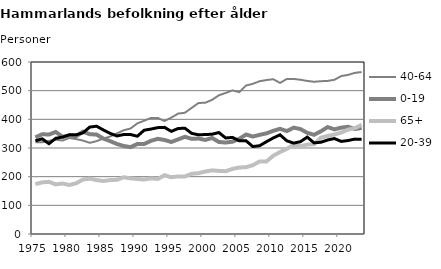
| Category | 40-64 | 0-19 | 65+ | 20-39 |
|---|---|---|---|---|
| 1975.0 | 320 | 337 | 174 | 325 |
| 1976.0 | 320 | 348 | 180 | 332 |
| 1977.0 | 325 | 347 | 182 | 315 |
| 1978.0 | 329 | 356 | 173 | 334 |
| 1979.0 | 326 | 339 | 176 | 338 |
| 1980.0 | 335 | 344 | 171 | 346 |
| 1981.0 | 331 | 341 | 177 | 346 |
| 1982.0 | 326 | 357 | 190 | 353 |
| 1983.0 | 318 | 348 | 193 | 373 |
| 1984.0 | 324 | 347 | 188 | 376 |
| 1985.0 | 333 | 333 | 185 | 363 |
| 1986.0 | 340 | 324 | 188 | 351 |
| 1987.0 | 351 | 314 | 189 | 342 |
| 1988.0 | 362 | 307 | 198 | 347 |
| 1989.0 | 368 | 303 | 194 | 347 |
| 1990.0 | 386 | 314 | 192 | 341 |
| 1991.0 | 395 | 314 | 190 | 362 |
| 1992.0 | 405 | 325 | 194 | 366 |
| 1993.0 | 405 | 332 | 192 | 371 |
| 1994.0 | 394 | 328 | 205 | 372 |
| 1995.0 | 406 | 321 | 198 | 358 |
| 1996.0 | 420 | 330 | 201 | 368 |
| 1997.0 | 423 | 339 | 201 | 369 |
| 1998.0 | 440 | 332 | 210 | 351 |
| 1999.0 | 457 | 333 | 212 | 346 |
| 2000.0 | 458 | 328 | 218 | 347 |
| 2001.0 | 468 | 335 | 222 | 348 |
| 2002.0 | 484 | 321 | 220 | 354 |
| 2003.0 | 492 | 319 | 219 | 335 |
| 2004.0 | 501 | 322 | 227 | 337 |
| 2005.0 | 495 | 332 | 232 | 325 |
| 2006.0 | 518 | 347 | 233 | 325 |
| 2007.0 | 524 | 340 | 240 | 305 |
| 2008.0 | 533 | 346 | 253 | 308 |
| 2009.0 | 537 | 351 | 253 | 322 |
| 2010.0 | 540 | 360 | 273 | 335 |
| 2011.0 | 527 | 367 | 286 | 346 |
| 2012.0 | 541 | 359 | 297 | 325 |
| 2013.0 | 541 | 371 | 311 | 317 |
| 2014.0 | 538 | 366 | 306 | 322 |
| 2015.0 | 534 | 353 | 312 | 338 |
| 2016.0 | 531 | 346 | 313 | 318 |
| 2017.0 | 533 | 358 | 336 | 320 |
| 2018.0 | 534 | 373 | 342 | 328 |
| 2019.0 | 538 | 365 | 347 | 333 |
| 2020.0 | 551 | 371 | 354 | 323 |
| 2021.0 | 555 | 374 | 364 | 326 |
| 2022.0 | 562 | 366 | 369 | 331 |
| 2023.0 | 565 | 370 | 381 | 330 |